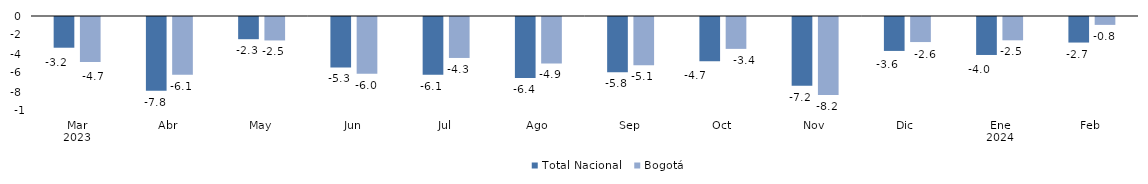
| Category | Total Nacional | Bogotá |
|---|---|---|
| 0 | -3.233 | -4.747 |
| 1 | -7.77 | -6.076 |
| 2 | -2.337 | -2.469 |
| 3 | -5.31 | -5.962 |
| 4 | -6.073 | -4.311 |
| 5 | -6.427 | -4.891 |
| 6 | -5.824 | -5.084 |
| 7 | -4.67 | -3.356 |
| 8 | -7.241 | -8.215 |
| 9 | -3.571 | -2.639 |
| 10 | -3.997 | -2.453 |
| 11 | -2.69 | -0.83 |